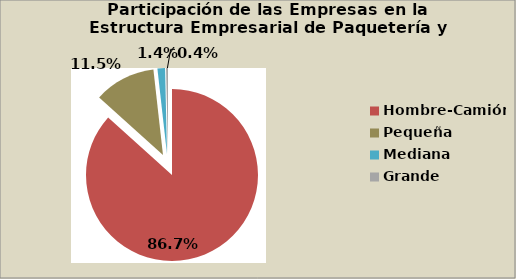
| Category | Series 0 |
|---|---|
| Hombre-Camión | 86.683 |
| Pequeña | 11.534 |
| Mediana | 1.427 |
| Grande | 0.357 |